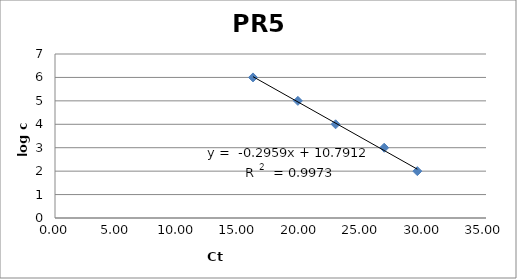
| Category | Series 0 |
|---|---|
| 16.0793 | 6 |
| 19.7221 | 5 |
| 22.7848 | 4 |
| 26.7333 | 3 |
| 29.4244 | 2 |